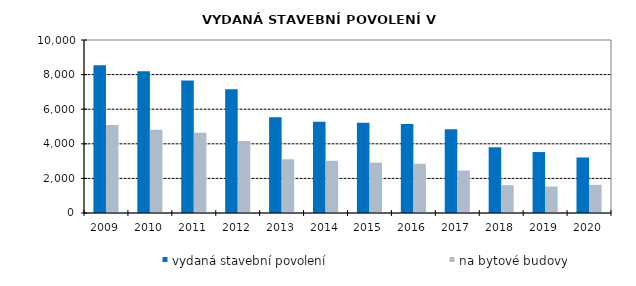
| Category | vydaná stavební povolení | na bytové budovy |
|---|---|---|
| 2009.0 | 8538 | 5081 |
| 2010.0 | 8188 | 4819 |
| 2011.0 | 7658 | 4636 |
| 2012.0 | 7147 | 4165 |
| 2013.0 | 5530 | 3107 |
| 2014.0 | 5273 | 3017 |
| 2015.0 | 5211 | 2910 |
| 2016.0 | 5147 | 2848 |
| 2017.0 | 4848 | 2456 |
| 2018.0 | 3805 | 1610 |
| 2019.0 | 3523 | 1529 |
| 2020.0 | 3211 | 1629 |